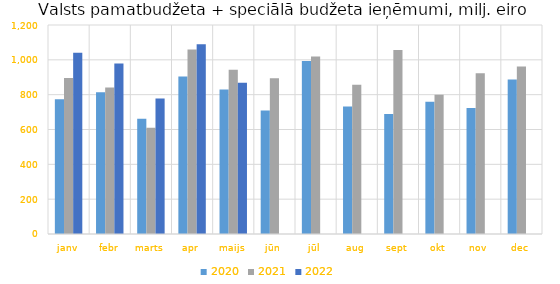
| Category | 2020 | 2021 | 2022 |
|---|---|---|---|
| janv | 773304.554 | 895228.16 | 1040582.151 |
| febr | 813349.653 | 841554.321 | 979083.527 |
| marts | 661290.08 | 610601.687 | 778451.361 |
| apr | 904088.68 | 1058636.045 | 1089522.586 |
| maijs | 829058.448 | 942788.526 | 869009.995 |
| jūn | 708595.585 | 894159.676 | 0 |
| jūl | 993444.303 | 1019598.16 | 0 |
| aug | 732304.111 | 856870.053 | 0 |
| sept | 689373.934 | 1056590.029 | 0 |
| okt | 759885.766 | 799251.823 | 0 |
| nov | 723122.398 | 922897.393 | 0 |
| dec | 887581.002 | 961417.995 | 0 |